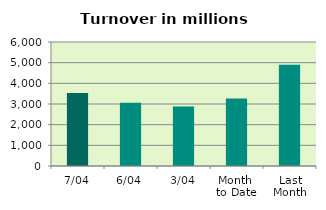
| Category | Series 0 |
|---|---|
| 7/04 | 3530.072 |
| 6/04 | 3058.966 |
| 3/04 | 2881.052 |
| Month 
to Date | 3271.976 |
| Last
Month | 4897.629 |